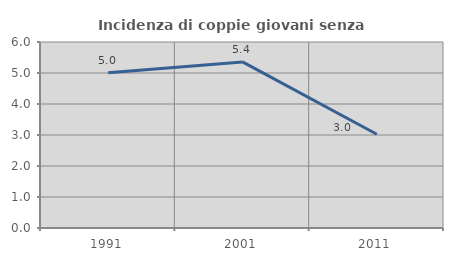
| Category | Incidenza di coppie giovani senza figli |
|---|---|
| 1991.0 | 5.006 |
| 2001.0 | 5.357 |
| 2011.0 | 3.025 |